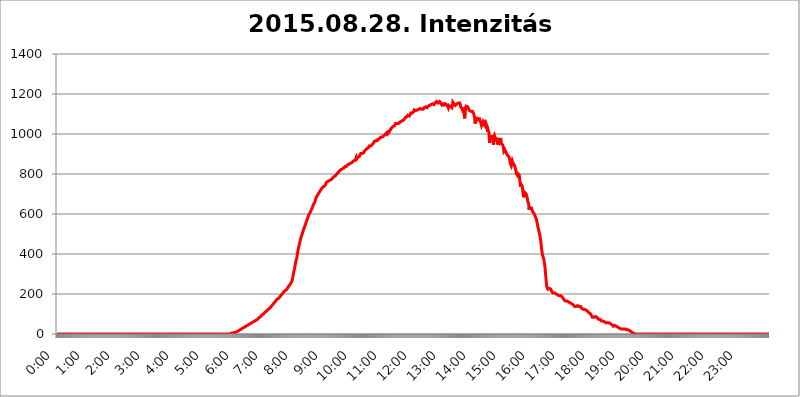
| Category | 2015.08.28. Intenzitás [W/m^2] |
|---|---|
| 0.0 | 0 |
| 0.0006944444444444445 | 0 |
| 0.001388888888888889 | 0 |
| 0.0020833333333333333 | 0 |
| 0.002777777777777778 | 0 |
| 0.003472222222222222 | 0 |
| 0.004166666666666667 | 0 |
| 0.004861111111111111 | 0 |
| 0.005555555555555556 | 0 |
| 0.0062499999999999995 | 0 |
| 0.006944444444444444 | 0 |
| 0.007638888888888889 | 0 |
| 0.008333333333333333 | 0 |
| 0.009027777777777779 | 0 |
| 0.009722222222222222 | 0 |
| 0.010416666666666666 | 0 |
| 0.011111111111111112 | 0 |
| 0.011805555555555555 | 0 |
| 0.012499999999999999 | 0 |
| 0.013194444444444444 | 0 |
| 0.013888888888888888 | 0 |
| 0.014583333333333332 | 0 |
| 0.015277777777777777 | 0 |
| 0.015972222222222224 | 0 |
| 0.016666666666666666 | 0 |
| 0.017361111111111112 | 0 |
| 0.018055555555555557 | 0 |
| 0.01875 | 0 |
| 0.019444444444444445 | 0 |
| 0.02013888888888889 | 0 |
| 0.020833333333333332 | 0 |
| 0.02152777777777778 | 0 |
| 0.022222222222222223 | 0 |
| 0.02291666666666667 | 0 |
| 0.02361111111111111 | 0 |
| 0.024305555555555556 | 0 |
| 0.024999999999999998 | 0 |
| 0.025694444444444447 | 0 |
| 0.02638888888888889 | 0 |
| 0.027083333333333334 | 0 |
| 0.027777777777777776 | 0 |
| 0.02847222222222222 | 0 |
| 0.029166666666666664 | 0 |
| 0.029861111111111113 | 0 |
| 0.030555555555555555 | 0 |
| 0.03125 | 0 |
| 0.03194444444444445 | 0 |
| 0.03263888888888889 | 0 |
| 0.03333333333333333 | 0 |
| 0.034027777777777775 | 0 |
| 0.034722222222222224 | 0 |
| 0.035416666666666666 | 0 |
| 0.036111111111111115 | 0 |
| 0.03680555555555556 | 0 |
| 0.0375 | 0 |
| 0.03819444444444444 | 0 |
| 0.03888888888888889 | 0 |
| 0.03958333333333333 | 0 |
| 0.04027777777777778 | 0 |
| 0.04097222222222222 | 0 |
| 0.041666666666666664 | 0 |
| 0.042361111111111106 | 0 |
| 0.04305555555555556 | 0 |
| 0.043750000000000004 | 0 |
| 0.044444444444444446 | 0 |
| 0.04513888888888889 | 0 |
| 0.04583333333333334 | 0 |
| 0.04652777777777778 | 0 |
| 0.04722222222222222 | 0 |
| 0.04791666666666666 | 0 |
| 0.04861111111111111 | 0 |
| 0.049305555555555554 | 0 |
| 0.049999999999999996 | 0 |
| 0.05069444444444445 | 0 |
| 0.051388888888888894 | 0 |
| 0.052083333333333336 | 0 |
| 0.05277777777777778 | 0 |
| 0.05347222222222222 | 0 |
| 0.05416666666666667 | 0 |
| 0.05486111111111111 | 0 |
| 0.05555555555555555 | 0 |
| 0.05625 | 0 |
| 0.05694444444444444 | 0 |
| 0.057638888888888885 | 0 |
| 0.05833333333333333 | 0 |
| 0.05902777777777778 | 0 |
| 0.059722222222222225 | 0 |
| 0.06041666666666667 | 0 |
| 0.061111111111111116 | 0 |
| 0.06180555555555556 | 0 |
| 0.0625 | 0 |
| 0.06319444444444444 | 0 |
| 0.06388888888888888 | 0 |
| 0.06458333333333334 | 0 |
| 0.06527777777777778 | 0 |
| 0.06597222222222222 | 0 |
| 0.06666666666666667 | 0 |
| 0.06736111111111111 | 0 |
| 0.06805555555555555 | 0 |
| 0.06874999999999999 | 0 |
| 0.06944444444444443 | 0 |
| 0.07013888888888889 | 0 |
| 0.07083333333333333 | 0 |
| 0.07152777777777779 | 0 |
| 0.07222222222222223 | 0 |
| 0.07291666666666667 | 0 |
| 0.07361111111111111 | 0 |
| 0.07430555555555556 | 0 |
| 0.075 | 0 |
| 0.07569444444444444 | 0 |
| 0.0763888888888889 | 0 |
| 0.07708333333333334 | 0 |
| 0.07777777777777778 | 0 |
| 0.07847222222222222 | 0 |
| 0.07916666666666666 | 0 |
| 0.0798611111111111 | 0 |
| 0.08055555555555556 | 0 |
| 0.08125 | 0 |
| 0.08194444444444444 | 0 |
| 0.08263888888888889 | 0 |
| 0.08333333333333333 | 0 |
| 0.08402777777777777 | 0 |
| 0.08472222222222221 | 0 |
| 0.08541666666666665 | 0 |
| 0.08611111111111112 | 0 |
| 0.08680555555555557 | 0 |
| 0.08750000000000001 | 0 |
| 0.08819444444444445 | 0 |
| 0.08888888888888889 | 0 |
| 0.08958333333333333 | 0 |
| 0.09027777777777778 | 0 |
| 0.09097222222222222 | 0 |
| 0.09166666666666667 | 0 |
| 0.09236111111111112 | 0 |
| 0.09305555555555556 | 0 |
| 0.09375 | 0 |
| 0.09444444444444444 | 0 |
| 0.09513888888888888 | 0 |
| 0.09583333333333333 | 0 |
| 0.09652777777777777 | 0 |
| 0.09722222222222222 | 0 |
| 0.09791666666666667 | 0 |
| 0.09861111111111111 | 0 |
| 0.09930555555555555 | 0 |
| 0.09999999999999999 | 0 |
| 0.10069444444444443 | 0 |
| 0.1013888888888889 | 0 |
| 0.10208333333333335 | 0 |
| 0.10277777777777779 | 0 |
| 0.10347222222222223 | 0 |
| 0.10416666666666667 | 0 |
| 0.10486111111111111 | 0 |
| 0.10555555555555556 | 0 |
| 0.10625 | 0 |
| 0.10694444444444444 | 0 |
| 0.1076388888888889 | 0 |
| 0.10833333333333334 | 0 |
| 0.10902777777777778 | 0 |
| 0.10972222222222222 | 0 |
| 0.1111111111111111 | 0 |
| 0.11180555555555556 | 0 |
| 0.11180555555555556 | 0 |
| 0.1125 | 0 |
| 0.11319444444444444 | 0 |
| 0.11388888888888889 | 0 |
| 0.11458333333333333 | 0 |
| 0.11527777777777777 | 0 |
| 0.11597222222222221 | 0 |
| 0.11666666666666665 | 0 |
| 0.1173611111111111 | 0 |
| 0.11805555555555557 | 0 |
| 0.11944444444444445 | 0 |
| 0.12013888888888889 | 0 |
| 0.12083333333333333 | 0 |
| 0.12152777777777778 | 0 |
| 0.12222222222222223 | 0 |
| 0.12291666666666667 | 0 |
| 0.12291666666666667 | 0 |
| 0.12361111111111112 | 0 |
| 0.12430555555555556 | 0 |
| 0.125 | 0 |
| 0.12569444444444444 | 0 |
| 0.12638888888888888 | 0 |
| 0.12708333333333333 | 0 |
| 0.16875 | 0 |
| 0.12847222222222224 | 0 |
| 0.12916666666666668 | 0 |
| 0.12986111111111112 | 0 |
| 0.13055555555555556 | 0 |
| 0.13125 | 0 |
| 0.13194444444444445 | 0 |
| 0.1326388888888889 | 0 |
| 0.13333333333333333 | 0 |
| 0.13402777777777777 | 0 |
| 0.13402777777777777 | 0 |
| 0.13472222222222222 | 0 |
| 0.13541666666666666 | 0 |
| 0.1361111111111111 | 0 |
| 0.13749999999999998 | 0 |
| 0.13819444444444443 | 0 |
| 0.1388888888888889 | 0 |
| 0.13958333333333334 | 0 |
| 0.14027777777777778 | 0 |
| 0.14097222222222222 | 0 |
| 0.14166666666666666 | 0 |
| 0.1423611111111111 | 0 |
| 0.14305555555555557 | 0 |
| 0.14375000000000002 | 0 |
| 0.14444444444444446 | 0 |
| 0.1451388888888889 | 0 |
| 0.1451388888888889 | 0 |
| 0.14652777777777778 | 0 |
| 0.14722222222222223 | 0 |
| 0.14791666666666667 | 0 |
| 0.1486111111111111 | 0 |
| 0.14930555555555555 | 0 |
| 0.15 | 0 |
| 0.15069444444444444 | 0 |
| 0.15138888888888888 | 0 |
| 0.15208333333333332 | 0 |
| 0.15277777777777776 | 0 |
| 0.15347222222222223 | 0 |
| 0.15416666666666667 | 0 |
| 0.15486111111111112 | 0 |
| 0.15555555555555556 | 0 |
| 0.15625 | 0 |
| 0.15694444444444444 | 0 |
| 0.15763888888888888 | 0 |
| 0.15833333333333333 | 0 |
| 0.15902777777777777 | 0 |
| 0.15972222222222224 | 0 |
| 0.16041666666666668 | 0 |
| 0.16111111111111112 | 0 |
| 0.16180555555555556 | 0 |
| 0.1625 | 0 |
| 0.16319444444444445 | 0 |
| 0.1638888888888889 | 0 |
| 0.16458333333333333 | 0 |
| 0.16527777777777777 | 0 |
| 0.16597222222222222 | 0 |
| 0.16666666666666666 | 0 |
| 0.1673611111111111 | 0 |
| 0.16805555555555554 | 0 |
| 0.16874999999999998 | 0 |
| 0.16944444444444443 | 0 |
| 0.17013888888888887 | 0 |
| 0.1708333333333333 | 0 |
| 0.17152777777777775 | 0 |
| 0.17222222222222225 | 0 |
| 0.1729166666666667 | 0 |
| 0.17361111111111113 | 0 |
| 0.17430555555555557 | 0 |
| 0.17500000000000002 | 0 |
| 0.17569444444444446 | 0 |
| 0.1763888888888889 | 0 |
| 0.17708333333333334 | 0 |
| 0.17777777777777778 | 0 |
| 0.17847222222222223 | 0 |
| 0.17916666666666667 | 0 |
| 0.1798611111111111 | 0 |
| 0.18055555555555555 | 0 |
| 0.18125 | 0 |
| 0.18194444444444444 | 0 |
| 0.1826388888888889 | 0 |
| 0.18333333333333335 | 0 |
| 0.1840277777777778 | 0 |
| 0.18472222222222223 | 0 |
| 0.18541666666666667 | 0 |
| 0.18611111111111112 | 0 |
| 0.18680555555555556 | 0 |
| 0.1875 | 0 |
| 0.18819444444444444 | 0 |
| 0.18888888888888888 | 0 |
| 0.18958333333333333 | 0 |
| 0.19027777777777777 | 0 |
| 0.1909722222222222 | 0 |
| 0.19166666666666665 | 0 |
| 0.19236111111111112 | 0 |
| 0.19305555555555554 | 0 |
| 0.19375 | 0 |
| 0.19444444444444445 | 0 |
| 0.1951388888888889 | 0 |
| 0.19583333333333333 | 0 |
| 0.19652777777777777 | 0 |
| 0.19722222222222222 | 0 |
| 0.19791666666666666 | 0 |
| 0.1986111111111111 | 0 |
| 0.19930555555555554 | 0 |
| 0.19999999999999998 | 0 |
| 0.20069444444444443 | 0 |
| 0.20138888888888887 | 0 |
| 0.2020833333333333 | 0 |
| 0.2027777777777778 | 0 |
| 0.2034722222222222 | 0 |
| 0.2041666666666667 | 0 |
| 0.20486111111111113 | 0 |
| 0.20555555555555557 | 0 |
| 0.20625000000000002 | 0 |
| 0.20694444444444446 | 0 |
| 0.2076388888888889 | 0 |
| 0.20833333333333334 | 0 |
| 0.20902777777777778 | 0 |
| 0.20972222222222223 | 0 |
| 0.21041666666666667 | 0 |
| 0.2111111111111111 | 0 |
| 0.21180555555555555 | 0 |
| 0.2125 | 0 |
| 0.21319444444444444 | 0 |
| 0.2138888888888889 | 0 |
| 0.21458333333333335 | 0 |
| 0.2152777777777778 | 0 |
| 0.21597222222222223 | 0 |
| 0.21666666666666667 | 0 |
| 0.21736111111111112 | 0 |
| 0.21805555555555556 | 0 |
| 0.21875 | 0 |
| 0.21944444444444444 | 0 |
| 0.22013888888888888 | 0 |
| 0.22083333333333333 | 0 |
| 0.22152777777777777 | 0 |
| 0.2222222222222222 | 0 |
| 0.22291666666666665 | 0 |
| 0.2236111111111111 | 0 |
| 0.22430555555555556 | 0 |
| 0.225 | 0 |
| 0.22569444444444445 | 0 |
| 0.2263888888888889 | 0 |
| 0.22708333333333333 | 0 |
| 0.22777777777777777 | 0 |
| 0.22847222222222222 | 0 |
| 0.22916666666666666 | 0 |
| 0.2298611111111111 | 0 |
| 0.23055555555555554 | 0 |
| 0.23124999999999998 | 0 |
| 0.23194444444444443 | 0 |
| 0.23263888888888887 | 0 |
| 0.2333333333333333 | 0 |
| 0.2340277777777778 | 0 |
| 0.2347222222222222 | 0 |
| 0.2354166666666667 | 0 |
| 0.23611111111111113 | 0 |
| 0.23680555555555557 | 0 |
| 0.23750000000000002 | 0 |
| 0.23819444444444446 | 0 |
| 0.2388888888888889 | 0 |
| 0.23958333333333334 | 0 |
| 0.24027777777777778 | 0 |
| 0.24097222222222223 | 0 |
| 0.24166666666666667 | 0 |
| 0.2423611111111111 | 3.525 |
| 0.24305555555555555 | 3.525 |
| 0.24375 | 3.525 |
| 0.24444444444444446 | 3.525 |
| 0.24513888888888888 | 3.525 |
| 0.24583333333333335 | 3.525 |
| 0.2465277777777778 | 3.525 |
| 0.24722222222222223 | 7.887 |
| 0.24791666666666667 | 7.887 |
| 0.24861111111111112 | 7.887 |
| 0.24930555555555556 | 7.887 |
| 0.25 | 7.887 |
| 0.25069444444444444 | 12.257 |
| 0.2513888888888889 | 12.257 |
| 0.2520833333333333 | 12.257 |
| 0.25277777777777777 | 12.257 |
| 0.2534722222222222 | 16.636 |
| 0.25416666666666665 | 16.636 |
| 0.2548611111111111 | 16.636 |
| 0.2555555555555556 | 21.024 |
| 0.25625000000000003 | 21.024 |
| 0.2569444444444445 | 21.024 |
| 0.2576388888888889 | 21.024 |
| 0.25833333333333336 | 25.419 |
| 0.2590277777777778 | 25.419 |
| 0.25972222222222224 | 29.823 |
| 0.2604166666666667 | 29.823 |
| 0.2611111111111111 | 29.823 |
| 0.26180555555555557 | 34.234 |
| 0.2625 | 34.234 |
| 0.26319444444444445 | 34.234 |
| 0.2638888888888889 | 38.653 |
| 0.26458333333333334 | 38.653 |
| 0.2652777777777778 | 38.653 |
| 0.2659722222222222 | 43.079 |
| 0.26666666666666666 | 43.079 |
| 0.2673611111111111 | 43.079 |
| 0.26805555555555555 | 47.511 |
| 0.26875 | 47.511 |
| 0.26944444444444443 | 47.511 |
| 0.2701388888888889 | 47.511 |
| 0.2708333333333333 | 51.951 |
| 0.27152777777777776 | 51.951 |
| 0.2722222222222222 | 56.398 |
| 0.27291666666666664 | 56.398 |
| 0.2736111111111111 | 56.398 |
| 0.2743055555555555 | 56.398 |
| 0.27499999999999997 | 60.85 |
| 0.27569444444444446 | 60.85 |
| 0.27638888888888885 | 65.31 |
| 0.27708333333333335 | 65.31 |
| 0.2777777777777778 | 65.31 |
| 0.27847222222222223 | 65.31 |
| 0.2791666666666667 | 69.775 |
| 0.2798611111111111 | 69.775 |
| 0.28055555555555556 | 74.246 |
| 0.28125 | 74.246 |
| 0.28194444444444444 | 74.246 |
| 0.2826388888888889 | 78.722 |
| 0.2833333333333333 | 83.205 |
| 0.28402777777777777 | 83.205 |
| 0.2847222222222222 | 87.692 |
| 0.28541666666666665 | 87.692 |
| 0.28611111111111115 | 92.184 |
| 0.28680555555555554 | 92.184 |
| 0.28750000000000003 | 96.682 |
| 0.2881944444444445 | 96.682 |
| 0.2888888888888889 | 101.184 |
| 0.28958333333333336 | 101.184 |
| 0.2902777777777778 | 101.184 |
| 0.29097222222222224 | 105.69 |
| 0.2916666666666667 | 110.201 |
| 0.2923611111111111 | 110.201 |
| 0.29305555555555557 | 110.201 |
| 0.29375 | 114.716 |
| 0.29444444444444445 | 119.235 |
| 0.2951388888888889 | 119.235 |
| 0.29583333333333334 | 123.758 |
| 0.2965277777777778 | 123.758 |
| 0.2972222222222222 | 128.284 |
| 0.29791666666666666 | 128.284 |
| 0.2986111111111111 | 132.814 |
| 0.29930555555555555 | 132.814 |
| 0.3 | 137.347 |
| 0.30069444444444443 | 137.347 |
| 0.3013888888888889 | 141.884 |
| 0.3020833333333333 | 146.423 |
| 0.30277777777777776 | 146.423 |
| 0.3034722222222222 | 150.964 |
| 0.30416666666666664 | 155.509 |
| 0.3048611111111111 | 155.509 |
| 0.3055555555555555 | 160.056 |
| 0.30624999999999997 | 164.605 |
| 0.3069444444444444 | 164.605 |
| 0.3076388888888889 | 169.156 |
| 0.30833333333333335 | 173.709 |
| 0.3090277777777778 | 173.709 |
| 0.30972222222222223 | 178.264 |
| 0.3104166666666667 | 178.264 |
| 0.3111111111111111 | 182.82 |
| 0.31180555555555556 | 182.82 |
| 0.3125 | 187.378 |
| 0.31319444444444444 | 191.937 |
| 0.3138888888888889 | 191.937 |
| 0.3145833333333333 | 196.497 |
| 0.31527777777777777 | 201.058 |
| 0.3159722222222222 | 201.058 |
| 0.31666666666666665 | 205.62 |
| 0.31736111111111115 | 210.182 |
| 0.31805555555555554 | 210.182 |
| 0.31875000000000003 | 214.746 |
| 0.3194444444444445 | 214.746 |
| 0.3201388888888889 | 219.309 |
| 0.32083333333333336 | 219.309 |
| 0.3215277777777778 | 223.873 |
| 0.32222222222222224 | 223.873 |
| 0.3229166666666667 | 228.436 |
| 0.3236111111111111 | 233 |
| 0.32430555555555557 | 237.564 |
| 0.325 | 242.127 |
| 0.32569444444444445 | 242.127 |
| 0.3263888888888889 | 246.689 |
| 0.32708333333333334 | 251.251 |
| 0.3277777777777778 | 255.813 |
| 0.3284722222222222 | 260.373 |
| 0.32916666666666666 | 264.932 |
| 0.3298611111111111 | 274.047 |
| 0.33055555555555555 | 287.709 |
| 0.33125 | 301.354 |
| 0.33194444444444443 | 314.98 |
| 0.3326388888888889 | 324.052 |
| 0.3333333333333333 | 337.639 |
| 0.3340277777777778 | 351.198 |
| 0.3347222222222222 | 364.728 |
| 0.3354166666666667 | 373.729 |
| 0.3361111111111111 | 382.715 |
| 0.3368055555555556 | 400.638 |
| 0.33749999999999997 | 414.035 |
| 0.33819444444444446 | 427.39 |
| 0.33888888888888885 | 436.27 |
| 0.33958333333333335 | 449.551 |
| 0.34027777777777773 | 458.38 |
| 0.34097222222222223 | 471.582 |
| 0.3416666666666666 | 480.356 |
| 0.3423611111111111 | 489.108 |
| 0.3430555555555555 | 493.475 |
| 0.34375 | 502.192 |
| 0.3444444444444445 | 510.885 |
| 0.3451388888888889 | 519.555 |
| 0.3458333333333334 | 523.88 |
| 0.34652777777777777 | 532.513 |
| 0.34722222222222227 | 536.82 |
| 0.34791666666666665 | 545.416 |
| 0.34861111111111115 | 553.986 |
| 0.34930555555555554 | 558.261 |
| 0.35000000000000003 | 566.793 |
| 0.3506944444444444 | 575.299 |
| 0.3513888888888889 | 579.542 |
| 0.3520833333333333 | 588.009 |
| 0.3527777777777778 | 596.45 |
| 0.3534722222222222 | 600.661 |
| 0.3541666666666667 | 604.864 |
| 0.3548611111111111 | 609.062 |
| 0.35555555555555557 | 613.252 |
| 0.35625 | 621.613 |
| 0.35694444444444445 | 625.784 |
| 0.3576388888888889 | 629.948 |
| 0.35833333333333334 | 638.256 |
| 0.3590277777777778 | 642.4 |
| 0.3597222222222222 | 650.667 |
| 0.36041666666666666 | 654.791 |
| 0.3611111111111111 | 658.909 |
| 0.36180555555555555 | 667.123 |
| 0.3625 | 671.22 |
| 0.36319444444444443 | 683.473 |
| 0.3638888888888889 | 687.544 |
| 0.3645833333333333 | 687.544 |
| 0.3652777777777778 | 695.666 |
| 0.3659722222222222 | 695.666 |
| 0.3666666666666667 | 703.762 |
| 0.3673611111111111 | 703.762 |
| 0.3680555555555556 | 707.8 |
| 0.36874999999999997 | 715.858 |
| 0.36944444444444446 | 715.858 |
| 0.37013888888888885 | 719.877 |
| 0.37083333333333335 | 727.896 |
| 0.37152777777777773 | 731.896 |
| 0.37222222222222223 | 731.896 |
| 0.3729166666666666 | 735.89 |
| 0.3736111111111111 | 735.89 |
| 0.3743055555555555 | 735.89 |
| 0.375 | 739.877 |
| 0.3756944444444445 | 743.859 |
| 0.3763888888888889 | 747.834 |
| 0.3770833333333334 | 751.803 |
| 0.37777777777777777 | 759.723 |
| 0.37847222222222227 | 759.723 |
| 0.37916666666666665 | 759.723 |
| 0.37986111111111115 | 763.674 |
| 0.38055555555555554 | 759.723 |
| 0.38125000000000003 | 767.62 |
| 0.3819444444444444 | 767.62 |
| 0.3826388888888889 | 767.62 |
| 0.3833333333333333 | 767.62 |
| 0.3840277777777778 | 771.559 |
| 0.3847222222222222 | 771.559 |
| 0.3854166666666667 | 771.559 |
| 0.3861111111111111 | 779.42 |
| 0.38680555555555557 | 783.342 |
| 0.3875 | 783.342 |
| 0.38819444444444445 | 787.258 |
| 0.3888888888888889 | 791.169 |
| 0.38958333333333334 | 791.169 |
| 0.3902777777777778 | 791.169 |
| 0.3909722222222222 | 795.074 |
| 0.39166666666666666 | 798.974 |
| 0.3923611111111111 | 802.868 |
| 0.39305555555555555 | 802.868 |
| 0.39375 | 806.757 |
| 0.39444444444444443 | 810.641 |
| 0.3951388888888889 | 810.641 |
| 0.3958333333333333 | 814.519 |
| 0.3965277777777778 | 814.519 |
| 0.3972222222222222 | 814.519 |
| 0.3979166666666667 | 822.26 |
| 0.3986111111111111 | 822.26 |
| 0.3993055555555556 | 826.123 |
| 0.39999999999999997 | 826.123 |
| 0.40069444444444446 | 829.981 |
| 0.40138888888888885 | 829.981 |
| 0.40208333333333335 | 829.981 |
| 0.40277777777777773 | 829.981 |
| 0.40347222222222223 | 837.682 |
| 0.4041666666666666 | 837.682 |
| 0.4048611111111111 | 837.682 |
| 0.4055555555555555 | 837.682 |
| 0.40625 | 841.526 |
| 0.4069444444444445 | 845.365 |
| 0.4076388888888889 | 845.365 |
| 0.4083333333333334 | 845.365 |
| 0.40902777777777777 | 849.199 |
| 0.40972222222222227 | 853.029 |
| 0.41041666666666665 | 853.029 |
| 0.41111111111111115 | 853.029 |
| 0.41180555555555554 | 853.029 |
| 0.41250000000000003 | 853.029 |
| 0.4131944444444444 | 856.855 |
| 0.4138888888888889 | 856.855 |
| 0.4145833333333333 | 860.676 |
| 0.4152777777777778 | 864.493 |
| 0.4159722222222222 | 868.305 |
| 0.4166666666666667 | 868.305 |
| 0.4173611111111111 | 868.305 |
| 0.41805555555555557 | 872.114 |
| 0.41875 | 875.918 |
| 0.41944444444444445 | 883.516 |
| 0.4201388888888889 | 875.918 |
| 0.42083333333333334 | 875.918 |
| 0.4215277777777778 | 883.516 |
| 0.4222222222222222 | 887.309 |
| 0.42291666666666666 | 887.309 |
| 0.4236111111111111 | 887.309 |
| 0.42430555555555555 | 894.885 |
| 0.425 | 894.885 |
| 0.42569444444444443 | 902.447 |
| 0.4263888888888889 | 906.223 |
| 0.4270833333333333 | 902.447 |
| 0.4277777777777778 | 902.447 |
| 0.4284722222222222 | 902.447 |
| 0.4291666666666667 | 906.223 |
| 0.4298611111111111 | 906.223 |
| 0.4305555555555556 | 913.766 |
| 0.43124999999999997 | 913.766 |
| 0.43194444444444446 | 917.534 |
| 0.43263888888888885 | 921.298 |
| 0.43333333333333335 | 925.06 |
| 0.43402777777777773 | 925.06 |
| 0.43472222222222223 | 928.819 |
| 0.4354166666666666 | 932.576 |
| 0.4361111111111111 | 928.819 |
| 0.4368055555555555 | 932.576 |
| 0.4375 | 940.082 |
| 0.4381944444444445 | 936.33 |
| 0.4388888888888889 | 936.33 |
| 0.4395833333333334 | 940.082 |
| 0.44027777777777777 | 940.082 |
| 0.44097222222222227 | 943.832 |
| 0.44166666666666665 | 947.58 |
| 0.44236111111111115 | 951.327 |
| 0.44305555555555554 | 951.327 |
| 0.44375000000000003 | 955.071 |
| 0.4444444444444444 | 962.555 |
| 0.4451388888888889 | 962.555 |
| 0.4458333333333333 | 966.295 |
| 0.4465277777777778 | 966.295 |
| 0.4472222222222222 | 966.295 |
| 0.4479166666666667 | 966.295 |
| 0.4486111111111111 | 966.295 |
| 0.44930555555555557 | 966.295 |
| 0.45 | 973.772 |
| 0.45069444444444445 | 973.772 |
| 0.4513888888888889 | 970.034 |
| 0.45208333333333334 | 977.508 |
| 0.4527777777777778 | 977.508 |
| 0.4534722222222222 | 981.244 |
| 0.45416666666666666 | 984.98 |
| 0.4548611111111111 | 984.98 |
| 0.45555555555555555 | 984.98 |
| 0.45625 | 984.98 |
| 0.45694444444444443 | 984.98 |
| 0.4576388888888889 | 988.714 |
| 0.4583333333333333 | 992.448 |
| 0.4590277777777778 | 992.448 |
| 0.4597222222222222 | 992.448 |
| 0.4604166666666667 | 999.916 |
| 0.4611111111111111 | 1003.65 |
| 0.4618055555555556 | 996.182 |
| 0.46249999999999997 | 1007.383 |
| 0.46319444444444446 | 999.916 |
| 0.46388888888888885 | 999.916 |
| 0.46458333333333335 | 1003.65 |
| 0.46527777777777773 | 1007.383 |
| 0.46597222222222223 | 1014.852 |
| 0.4666666666666666 | 1018.587 |
| 0.4673611111111111 | 1022.323 |
| 0.4680555555555555 | 1022.323 |
| 0.46875 | 1029.798 |
| 0.4694444444444445 | 1029.798 |
| 0.4701388888888889 | 1029.798 |
| 0.4708333333333334 | 1037.277 |
| 0.47152777777777777 | 1041.019 |
| 0.47222222222222227 | 1041.019 |
| 0.47291666666666665 | 1041.019 |
| 0.47361111111111115 | 1044.762 |
| 0.47430555555555554 | 1052.255 |
| 0.47500000000000003 | 1052.255 |
| 0.4756944444444444 | 1048.508 |
| 0.4763888888888889 | 1052.255 |
| 0.4770833333333333 | 1056.004 |
| 0.4777777777777778 | 1052.255 |
| 0.4784722222222222 | 1052.255 |
| 0.4791666666666667 | 1056.004 |
| 0.4798611111111111 | 1056.004 |
| 0.48055555555555557 | 1059.756 |
| 0.48125 | 1059.756 |
| 0.48194444444444445 | 1063.51 |
| 0.4826388888888889 | 1063.51 |
| 0.48333333333333334 | 1063.51 |
| 0.4840277777777778 | 1067.267 |
| 0.4847222222222222 | 1067.267 |
| 0.48541666666666666 | 1067.267 |
| 0.4861111111111111 | 1071.027 |
| 0.48680555555555555 | 1074.789 |
| 0.4875 | 1078.555 |
| 0.48819444444444443 | 1082.324 |
| 0.4888888888888889 | 1082.324 |
| 0.4895833333333333 | 1086.097 |
| 0.4902777777777778 | 1086.097 |
| 0.4909722222222222 | 1089.873 |
| 0.4916666666666667 | 1093.653 |
| 0.4923611111111111 | 1093.653 |
| 0.4930555555555556 | 1093.653 |
| 0.49374999999999997 | 1089.873 |
| 0.49444444444444446 | 1093.653 |
| 0.49513888888888885 | 1097.437 |
| 0.49583333333333335 | 1105.019 |
| 0.49652777777777773 | 1105.019 |
| 0.49722222222222223 | 1105.019 |
| 0.4979166666666666 | 1105.019 |
| 0.4986111111111111 | 1108.816 |
| 0.4993055555555555 | 1108.816 |
| 0.5 | 1112.618 |
| 0.5006944444444444 | 1120.238 |
| 0.5013888888888889 | 1116.426 |
| 0.5020833333333333 | 1116.426 |
| 0.5027777777777778 | 1116.426 |
| 0.5034722222222222 | 1116.426 |
| 0.5041666666666667 | 1116.426 |
| 0.5048611111111111 | 1120.238 |
| 0.5055555555555555 | 1120.238 |
| 0.50625 | 1124.056 |
| 0.5069444444444444 | 1124.056 |
| 0.5076388888888889 | 1127.879 |
| 0.5083333333333333 | 1127.879 |
| 0.5090277777777777 | 1127.879 |
| 0.5097222222222222 | 1124.056 |
| 0.5104166666666666 | 1124.056 |
| 0.5111111111111112 | 1124.056 |
| 0.5118055555555555 | 1124.056 |
| 0.5125000000000001 | 1124.056 |
| 0.5131944444444444 | 1124.056 |
| 0.513888888888889 | 1127.879 |
| 0.5145833333333333 | 1131.708 |
| 0.5152777777777778 | 1135.543 |
| 0.5159722222222222 | 1135.543 |
| 0.5166666666666667 | 1135.543 |
| 0.517361111111111 | 1135.543 |
| 0.5180555555555556 | 1131.708 |
| 0.5187499999999999 | 1131.708 |
| 0.5194444444444445 | 1131.708 |
| 0.5201388888888888 | 1139.384 |
| 0.5208333333333334 | 1139.384 |
| 0.5215277777777778 | 1139.384 |
| 0.5222222222222223 | 1143.232 |
| 0.5229166666666667 | 1139.384 |
| 0.5236111111111111 | 1147.086 |
| 0.5243055555555556 | 1147.086 |
| 0.525 | 1147.086 |
| 0.5256944444444445 | 1147.086 |
| 0.5263888888888889 | 1150.946 |
| 0.5270833333333333 | 1147.086 |
| 0.5277777777777778 | 1147.086 |
| 0.5284722222222222 | 1147.086 |
| 0.5291666666666667 | 1150.946 |
| 0.5298611111111111 | 1154.814 |
| 0.5305555555555556 | 1158.689 |
| 0.53125 | 1154.814 |
| 0.5319444444444444 | 1162.571 |
| 0.5326388888888889 | 1158.689 |
| 0.5333333333333333 | 1158.689 |
| 0.5340277777777778 | 1154.814 |
| 0.5347222222222222 | 1158.689 |
| 0.5354166666666667 | 1158.689 |
| 0.5361111111111111 | 1162.571 |
| 0.5368055555555555 | 1162.571 |
| 0.5375 | 1158.689 |
| 0.5381944444444444 | 1154.814 |
| 0.5388888888888889 | 1150.946 |
| 0.5395833333333333 | 1143.232 |
| 0.5402777777777777 | 1139.384 |
| 0.5409722222222222 | 1139.384 |
| 0.5416666666666666 | 1143.232 |
| 0.5423611111111112 | 1150.946 |
| 0.5430555555555555 | 1154.814 |
| 0.5437500000000001 | 1150.946 |
| 0.5444444444444444 | 1150.946 |
| 0.545138888888889 | 1147.086 |
| 0.5458333333333333 | 1147.086 |
| 0.5465277777777778 | 1143.232 |
| 0.5472222222222222 | 1150.946 |
| 0.5479166666666667 | 1139.384 |
| 0.548611111111111 | 1131.708 |
| 0.5493055555555556 | 1139.384 |
| 0.5499999999999999 | 1139.384 |
| 0.5506944444444445 | 1143.232 |
| 0.5513888888888888 | 1139.384 |
| 0.5520833333333334 | 1139.384 |
| 0.5527777777777778 | 1139.384 |
| 0.5534722222222223 | 1131.708 |
| 0.5541666666666667 | 1139.384 |
| 0.5548611111111111 | 1158.689 |
| 0.5555555555555556 | 1154.814 |
| 0.55625 | 1150.946 |
| 0.5569444444444445 | 1150.946 |
| 0.5576388888888889 | 1150.946 |
| 0.5583333333333333 | 1143.232 |
| 0.5590277777777778 | 1147.086 |
| 0.5597222222222222 | 1147.086 |
| 0.5604166666666667 | 1150.946 |
| 0.5611111111111111 | 1150.946 |
| 0.5618055555555556 | 1150.946 |
| 0.5625 | 1154.814 |
| 0.5631944444444444 | 1154.814 |
| 0.5638888888888889 | 1154.814 |
| 0.5645833333333333 | 1154.814 |
| 0.5652777777777778 | 1147.086 |
| 0.5659722222222222 | 1135.543 |
| 0.5666666666666667 | 1131.708 |
| 0.5673611111111111 | 1135.543 |
| 0.5680555555555555 | 1124.056 |
| 0.56875 | 1131.708 |
| 0.5694444444444444 | 1108.816 |
| 0.5701388888888889 | 1120.238 |
| 0.5708333333333333 | 1120.238 |
| 0.5715277777777777 | 1078.555 |
| 0.5722222222222222 | 1127.879 |
| 0.5729166666666666 | 1131.708 |
| 0.5736111111111112 | 1139.384 |
| 0.5743055555555555 | 1135.543 |
| 0.5750000000000001 | 1135.543 |
| 0.5756944444444444 | 1135.543 |
| 0.576388888888889 | 1131.708 |
| 0.5770833333333333 | 1124.056 |
| 0.5777777777777778 | 1127.879 |
| 0.5784722222222222 | 1116.426 |
| 0.5791666666666667 | 1116.426 |
| 0.579861111111111 | 1116.426 |
| 0.5805555555555556 | 1112.618 |
| 0.5812499999999999 | 1112.618 |
| 0.5819444444444445 | 1112.618 |
| 0.5826388888888888 | 1112.618 |
| 0.5833333333333334 | 1112.618 |
| 0.5840277777777778 | 1101.226 |
| 0.5847222222222223 | 1093.653 |
| 0.5854166666666667 | 1078.555 |
| 0.5861111111111111 | 1052.255 |
| 0.5868055555555556 | 1052.255 |
| 0.5875 | 1078.555 |
| 0.5881944444444445 | 1078.555 |
| 0.5888888888888889 | 1074.789 |
| 0.5895833333333333 | 1078.555 |
| 0.5902777777777778 | 1071.027 |
| 0.5909722222222222 | 1067.267 |
| 0.5916666666666667 | 1074.789 |
| 0.5923611111111111 | 1074.789 |
| 0.5930555555555556 | 1067.267 |
| 0.59375 | 1059.756 |
| 0.5944444444444444 | 1059.756 |
| 0.5951388888888889 | 1041.019 |
| 0.5958333333333333 | 1037.277 |
| 0.5965277777777778 | 1052.255 |
| 0.5972222222222222 | 1059.756 |
| 0.5979166666666667 | 1052.255 |
| 0.5986111111111111 | 1048.508 |
| 0.5993055555555555 | 1044.762 |
| 0.6 | 1052.255 |
| 0.6006944444444444 | 1044.762 |
| 0.6013888888888889 | 1052.255 |
| 0.6020833333333333 | 1044.762 |
| 0.6027777777777777 | 1033.537 |
| 0.6034722222222222 | 1011.118 |
| 0.6041666666666666 | 1022.323 |
| 0.6048611111111112 | 1018.587 |
| 0.6055555555555555 | 1007.383 |
| 0.6062500000000001 | 955.071 |
| 0.6069444444444444 | 977.508 |
| 0.607638888888889 | 992.448 |
| 0.6083333333333333 | 973.772 |
| 0.6090277777777778 | 992.448 |
| 0.6097222222222222 | 988.714 |
| 0.6104166666666667 | 973.772 |
| 0.611111111111111 | 984.98 |
| 0.6118055555555556 | 947.58 |
| 0.6124999999999999 | 984.98 |
| 0.6131944444444445 | 992.448 |
| 0.6138888888888888 | 984.98 |
| 0.6145833333333334 | 981.244 |
| 0.6152777777777778 | 973.772 |
| 0.6159722222222223 | 977.508 |
| 0.6166666666666667 | 966.295 |
| 0.6173611111111111 | 947.58 |
| 0.6180555555555556 | 966.295 |
| 0.61875 | 970.034 |
| 0.6194444444444445 | 958.814 |
| 0.6201388888888889 | 973.772 |
| 0.6208333333333333 | 973.772 |
| 0.6215277777777778 | 977.508 |
| 0.6222222222222222 | 973.772 |
| 0.6229166666666667 | 951.327 |
| 0.6236111111111111 | 955.071 |
| 0.6243055555555556 | 947.58 |
| 0.625 | 943.832 |
| 0.6256944444444444 | 932.576 |
| 0.6263888888888889 | 913.766 |
| 0.6270833333333333 | 917.534 |
| 0.6277777777777778 | 921.298 |
| 0.6284722222222222 | 921.298 |
| 0.6291666666666667 | 909.996 |
| 0.6298611111111111 | 906.223 |
| 0.6305555555555555 | 906.223 |
| 0.63125 | 894.885 |
| 0.6319444444444444 | 891.099 |
| 0.6326388888888889 | 894.885 |
| 0.6333333333333333 | 887.309 |
| 0.6340277777777777 | 883.516 |
| 0.6347222222222222 | 872.114 |
| 0.6354166666666666 | 853.029 |
| 0.6361111111111112 | 849.199 |
| 0.6368055555555555 | 841.526 |
| 0.6375000000000001 | 841.526 |
| 0.6381944444444444 | 864.493 |
| 0.638888888888889 | 856.855 |
| 0.6395833333333333 | 853.029 |
| 0.6402777777777778 | 853.029 |
| 0.6409722222222222 | 845.365 |
| 0.6416666666666667 | 841.526 |
| 0.642361111111111 | 829.981 |
| 0.6430555555555556 | 822.26 |
| 0.6437499999999999 | 802.868 |
| 0.6444444444444445 | 798.974 |
| 0.6451388888888888 | 795.074 |
| 0.6458333333333334 | 802.868 |
| 0.6465277777777778 | 806.757 |
| 0.6472222222222223 | 802.868 |
| 0.6479166666666667 | 795.074 |
| 0.6486111111111111 | 791.169 |
| 0.6493055555555556 | 751.803 |
| 0.65 | 735.89 |
| 0.6506944444444445 | 747.834 |
| 0.6513888888888889 | 747.834 |
| 0.6520833333333333 | 739.877 |
| 0.6527777777777778 | 735.89 |
| 0.6534722222222222 | 699.717 |
| 0.6541666666666667 | 683.473 |
| 0.6548611111111111 | 687.544 |
| 0.6555555555555556 | 707.8 |
| 0.65625 | 711.832 |
| 0.6569444444444444 | 707.8 |
| 0.6576388888888889 | 699.717 |
| 0.6583333333333333 | 691.608 |
| 0.6590277777777778 | 683.473 |
| 0.6597222222222222 | 667.123 |
| 0.6604166666666667 | 663.019 |
| 0.6611111111111111 | 650.667 |
| 0.6618055555555555 | 621.613 |
| 0.6625 | 638.256 |
| 0.6631944444444444 | 629.948 |
| 0.6638888888888889 | 621.613 |
| 0.6645833333333333 | 634.105 |
| 0.6652777777777777 | 625.784 |
| 0.6659722222222222 | 629.948 |
| 0.6666666666666666 | 613.252 |
| 0.6673611111111111 | 609.062 |
| 0.6680555555555556 | 604.864 |
| 0.6687500000000001 | 609.062 |
| 0.6694444444444444 | 596.45 |
| 0.6701388888888888 | 596.45 |
| 0.6708333333333334 | 592.233 |
| 0.6715277777777778 | 579.542 |
| 0.6722222222222222 | 571.049 |
| 0.6729166666666666 | 558.261 |
| 0.6736111111111112 | 545.416 |
| 0.6743055555555556 | 532.513 |
| 0.6749999999999999 | 523.88 |
| 0.6756944444444444 | 510.885 |
| 0.6763888888888889 | 502.192 |
| 0.6770833333333334 | 489.108 |
| 0.6777777777777777 | 475.972 |
| 0.6784722222222223 | 453.968 |
| 0.6791666666666667 | 431.833 |
| 0.6798611111111111 | 409.574 |
| 0.6805555555555555 | 396.164 |
| 0.68125 | 387.202 |
| 0.6819444444444445 | 378.224 |
| 0.6826388888888889 | 369.23 |
| 0.6833333333333332 | 351.198 |
| 0.6840277777777778 | 337.639 |
| 0.6847222222222222 | 305.898 |
| 0.6854166666666667 | 278.603 |
| 0.686111111111111 | 251.251 |
| 0.6868055555555556 | 233 |
| 0.6875 | 228.436 |
| 0.6881944444444444 | 223.873 |
| 0.688888888888889 | 223.873 |
| 0.6895833333333333 | 228.436 |
| 0.6902777777777778 | 228.436 |
| 0.6909722222222222 | 228.436 |
| 0.6916666666666668 | 228.436 |
| 0.6923611111111111 | 223.873 |
| 0.6930555555555555 | 214.746 |
| 0.69375 | 214.746 |
| 0.6944444444444445 | 210.182 |
| 0.6951388888888889 | 205.62 |
| 0.6958333333333333 | 205.62 |
| 0.6965277777777777 | 205.62 |
| 0.6972222222222223 | 205.62 |
| 0.6979166666666666 | 201.058 |
| 0.6986111111111111 | 201.058 |
| 0.6993055555555556 | 201.058 |
| 0.7000000000000001 | 196.497 |
| 0.7006944444444444 | 196.497 |
| 0.7013888888888888 | 196.497 |
| 0.7020833333333334 | 196.497 |
| 0.7027777777777778 | 196.497 |
| 0.7034722222222222 | 191.937 |
| 0.7041666666666666 | 191.937 |
| 0.7048611111111112 | 191.937 |
| 0.7055555555555556 | 191.937 |
| 0.7062499999999999 | 187.378 |
| 0.7069444444444444 | 187.378 |
| 0.7076388888888889 | 187.378 |
| 0.7083333333333334 | 187.378 |
| 0.7090277777777777 | 182.82 |
| 0.7097222222222223 | 178.264 |
| 0.7104166666666667 | 173.709 |
| 0.7111111111111111 | 169.156 |
| 0.7118055555555555 | 164.605 |
| 0.7125 | 164.605 |
| 0.7131944444444445 | 164.605 |
| 0.7138888888888889 | 164.605 |
| 0.7145833333333332 | 164.605 |
| 0.7152777777777778 | 164.605 |
| 0.7159722222222222 | 164.605 |
| 0.7166666666666667 | 160.056 |
| 0.717361111111111 | 160.056 |
| 0.7180555555555556 | 160.056 |
| 0.71875 | 155.509 |
| 0.7194444444444444 | 155.509 |
| 0.720138888888889 | 155.509 |
| 0.7208333333333333 | 155.509 |
| 0.7215277777777778 | 150.964 |
| 0.7222222222222222 | 150.964 |
| 0.7229166666666668 | 146.423 |
| 0.7236111111111111 | 146.423 |
| 0.7243055555555555 | 141.884 |
| 0.725 | 141.884 |
| 0.7256944444444445 | 137.347 |
| 0.7263888888888889 | 137.347 |
| 0.7270833333333333 | 137.347 |
| 0.7277777777777777 | 137.347 |
| 0.7284722222222223 | 137.347 |
| 0.7291666666666666 | 137.347 |
| 0.7298611111111111 | 141.884 |
| 0.7305555555555556 | 137.347 |
| 0.7312500000000001 | 137.347 |
| 0.7319444444444444 | 137.347 |
| 0.7326388888888888 | 137.347 |
| 0.7333333333333334 | 137.347 |
| 0.7340277777777778 | 137.347 |
| 0.7347222222222222 | 132.814 |
| 0.7354166666666666 | 128.284 |
| 0.7361111111111112 | 123.758 |
| 0.7368055555555556 | 123.758 |
| 0.7374999999999999 | 123.758 |
| 0.7381944444444444 | 123.758 |
| 0.7388888888888889 | 123.758 |
| 0.7395833333333334 | 123.758 |
| 0.7402777777777777 | 119.235 |
| 0.7409722222222223 | 119.235 |
| 0.7416666666666667 | 119.235 |
| 0.7423611111111111 | 114.716 |
| 0.7430555555555555 | 114.716 |
| 0.74375 | 114.716 |
| 0.7444444444444445 | 114.716 |
| 0.7451388888888889 | 110.201 |
| 0.7458333333333332 | 105.69 |
| 0.7465277777777778 | 105.69 |
| 0.7472222222222222 | 101.184 |
| 0.7479166666666667 | 101.184 |
| 0.748611111111111 | 96.682 |
| 0.7493055555555556 | 92.184 |
| 0.75 | 87.692 |
| 0.7506944444444444 | 83.205 |
| 0.751388888888889 | 83.205 |
| 0.7520833333333333 | 83.205 |
| 0.7527777777777778 | 83.205 |
| 0.7534722222222222 | 83.205 |
| 0.7541666666666668 | 83.205 |
| 0.7548611111111111 | 87.692 |
| 0.7555555555555555 | 83.205 |
| 0.75625 | 83.205 |
| 0.7569444444444445 | 83.205 |
| 0.7576388888888889 | 78.722 |
| 0.7583333333333333 | 78.722 |
| 0.7590277777777777 | 74.246 |
| 0.7597222222222223 | 74.246 |
| 0.7604166666666666 | 74.246 |
| 0.7611111111111111 | 74.246 |
| 0.7618055555555556 | 69.775 |
| 0.7625000000000001 | 69.775 |
| 0.7631944444444444 | 65.31 |
| 0.7638888888888888 | 65.31 |
| 0.7645833333333334 | 65.31 |
| 0.7652777777777778 | 65.31 |
| 0.7659722222222222 | 65.31 |
| 0.7666666666666666 | 60.85 |
| 0.7673611111111112 | 60.85 |
| 0.7680555555555556 | 60.85 |
| 0.7687499999999999 | 60.85 |
| 0.7694444444444444 | 56.398 |
| 0.7701388888888889 | 56.398 |
| 0.7708333333333334 | 56.398 |
| 0.7715277777777777 | 56.398 |
| 0.7722222222222223 | 56.398 |
| 0.7729166666666667 | 56.398 |
| 0.7736111111111111 | 56.398 |
| 0.7743055555555555 | 51.951 |
| 0.775 | 51.951 |
| 0.7756944444444445 | 51.951 |
| 0.7763888888888889 | 47.511 |
| 0.7770833333333332 | 47.511 |
| 0.7777777777777778 | 47.511 |
| 0.7784722222222222 | 43.079 |
| 0.7791666666666667 | 43.079 |
| 0.779861111111111 | 38.653 |
| 0.7805555555555556 | 38.653 |
| 0.78125 | 43.079 |
| 0.7819444444444444 | 43.079 |
| 0.782638888888889 | 43.079 |
| 0.7833333333333333 | 38.653 |
| 0.7840277777777778 | 38.653 |
| 0.7847222222222222 | 38.653 |
| 0.7854166666666668 | 38.653 |
| 0.7861111111111111 | 34.234 |
| 0.7868055555555555 | 34.234 |
| 0.7875 | 29.823 |
| 0.7881944444444445 | 29.823 |
| 0.7888888888888889 | 29.823 |
| 0.7895833333333333 | 29.823 |
| 0.7902777777777777 | 25.419 |
| 0.7909722222222223 | 25.419 |
| 0.7916666666666666 | 25.419 |
| 0.7923611111111111 | 25.419 |
| 0.7930555555555556 | 25.419 |
| 0.7937500000000001 | 25.419 |
| 0.7944444444444444 | 25.419 |
| 0.7951388888888888 | 25.419 |
| 0.7958333333333334 | 25.419 |
| 0.7965277777777778 | 25.419 |
| 0.7972222222222222 | 25.419 |
| 0.7979166666666666 | 25.419 |
| 0.7986111111111112 | 21.024 |
| 0.7993055555555556 | 21.024 |
| 0.7999999999999999 | 21.024 |
| 0.8006944444444444 | 21.024 |
| 0.8013888888888889 | 16.636 |
| 0.8020833333333334 | 16.636 |
| 0.8027777777777777 | 16.636 |
| 0.8034722222222223 | 12.257 |
| 0.8041666666666667 | 12.257 |
| 0.8048611111111111 | 12.257 |
| 0.8055555555555555 | 12.257 |
| 0.80625 | 7.887 |
| 0.8069444444444445 | 3.525 |
| 0.8076388888888889 | 3.525 |
| 0.8083333333333332 | 3.525 |
| 0.8090277777777778 | 3.525 |
| 0.8097222222222222 | 3.525 |
| 0.8104166666666667 | 3.525 |
| 0.811111111111111 | 0 |
| 0.8118055555555556 | 0 |
| 0.8125 | 0 |
| 0.8131944444444444 | 0 |
| 0.813888888888889 | 0 |
| 0.8145833333333333 | 0 |
| 0.8152777777777778 | 0 |
| 0.8159722222222222 | 0 |
| 0.8166666666666668 | 0 |
| 0.8173611111111111 | 0 |
| 0.8180555555555555 | 0 |
| 0.81875 | 0 |
| 0.8194444444444445 | 0 |
| 0.8201388888888889 | 0 |
| 0.8208333333333333 | 0 |
| 0.8215277777777777 | 0 |
| 0.8222222222222223 | 0 |
| 0.8229166666666666 | 0 |
| 0.8236111111111111 | 0 |
| 0.8243055555555556 | 0 |
| 0.8250000000000001 | 0 |
| 0.8256944444444444 | 0 |
| 0.8263888888888888 | 0 |
| 0.8270833333333334 | 0 |
| 0.8277777777777778 | 0 |
| 0.8284722222222222 | 0 |
| 0.8291666666666666 | 0 |
| 0.8298611111111112 | 0 |
| 0.8305555555555556 | 0 |
| 0.8312499999999999 | 0 |
| 0.8319444444444444 | 0 |
| 0.8326388888888889 | 0 |
| 0.8333333333333334 | 0 |
| 0.8340277777777777 | 0 |
| 0.8347222222222223 | 0 |
| 0.8354166666666667 | 0 |
| 0.8361111111111111 | 0 |
| 0.8368055555555555 | 0 |
| 0.8375 | 0 |
| 0.8381944444444445 | 0 |
| 0.8388888888888889 | 0 |
| 0.8395833333333332 | 0 |
| 0.8402777777777778 | 0 |
| 0.8409722222222222 | 0 |
| 0.8416666666666667 | 0 |
| 0.842361111111111 | 0 |
| 0.8430555555555556 | 0 |
| 0.84375 | 0 |
| 0.8444444444444444 | 0 |
| 0.845138888888889 | 0 |
| 0.8458333333333333 | 0 |
| 0.8465277777777778 | 0 |
| 0.8472222222222222 | 0 |
| 0.8479166666666668 | 0 |
| 0.8486111111111111 | 0 |
| 0.8493055555555555 | 0 |
| 0.85 | 0 |
| 0.8506944444444445 | 0 |
| 0.8513888888888889 | 0 |
| 0.8520833333333333 | 0 |
| 0.8527777777777777 | 0 |
| 0.8534722222222223 | 0 |
| 0.8541666666666666 | 0 |
| 0.8548611111111111 | 0 |
| 0.8555555555555556 | 0 |
| 0.8562500000000001 | 0 |
| 0.8569444444444444 | 0 |
| 0.8576388888888888 | 0 |
| 0.8583333333333334 | 0 |
| 0.8590277777777778 | 0 |
| 0.8597222222222222 | 0 |
| 0.8604166666666666 | 0 |
| 0.8611111111111112 | 0 |
| 0.8618055555555556 | 0 |
| 0.8624999999999999 | 0 |
| 0.8631944444444444 | 0 |
| 0.8638888888888889 | 0 |
| 0.8645833333333334 | 0 |
| 0.8652777777777777 | 0 |
| 0.8659722222222223 | 0 |
| 0.8666666666666667 | 0 |
| 0.8673611111111111 | 0 |
| 0.8680555555555555 | 0 |
| 0.86875 | 0 |
| 0.8694444444444445 | 0 |
| 0.8701388888888889 | 0 |
| 0.8708333333333332 | 0 |
| 0.8715277777777778 | 0 |
| 0.8722222222222222 | 0 |
| 0.8729166666666667 | 0 |
| 0.873611111111111 | 0 |
| 0.8743055555555556 | 0 |
| 0.875 | 0 |
| 0.8756944444444444 | 0 |
| 0.876388888888889 | 0 |
| 0.8770833333333333 | 0 |
| 0.8777777777777778 | 0 |
| 0.8784722222222222 | 0 |
| 0.8791666666666668 | 0 |
| 0.8798611111111111 | 0 |
| 0.8805555555555555 | 0 |
| 0.88125 | 0 |
| 0.8819444444444445 | 0 |
| 0.8826388888888889 | 0 |
| 0.8833333333333333 | 0 |
| 0.8840277777777777 | 0 |
| 0.8847222222222223 | 0 |
| 0.8854166666666666 | 0 |
| 0.8861111111111111 | 0 |
| 0.8868055555555556 | 0 |
| 0.8875000000000001 | 0 |
| 0.8881944444444444 | 0 |
| 0.8888888888888888 | 0 |
| 0.8895833333333334 | 0 |
| 0.8902777777777778 | 0 |
| 0.8909722222222222 | 0 |
| 0.8916666666666666 | 0 |
| 0.8923611111111112 | 0 |
| 0.8930555555555556 | 0 |
| 0.8937499999999999 | 0 |
| 0.8944444444444444 | 0 |
| 0.8951388888888889 | 0 |
| 0.8958333333333334 | 0 |
| 0.8965277777777777 | 0 |
| 0.8972222222222223 | 0 |
| 0.8979166666666667 | 0 |
| 0.8986111111111111 | 0 |
| 0.8993055555555555 | 0 |
| 0.9 | 0 |
| 0.9006944444444445 | 0 |
| 0.9013888888888889 | 0 |
| 0.9020833333333332 | 0 |
| 0.9027777777777778 | 0 |
| 0.9034722222222222 | 0 |
| 0.9041666666666667 | 0 |
| 0.904861111111111 | 0 |
| 0.9055555555555556 | 0 |
| 0.90625 | 0 |
| 0.9069444444444444 | 0 |
| 0.907638888888889 | 0 |
| 0.9083333333333333 | 0 |
| 0.9090277777777778 | 0 |
| 0.9097222222222222 | 0 |
| 0.9104166666666668 | 0 |
| 0.9111111111111111 | 0 |
| 0.9118055555555555 | 0 |
| 0.9125 | 0 |
| 0.9131944444444445 | 0 |
| 0.9138888888888889 | 0 |
| 0.9145833333333333 | 0 |
| 0.9152777777777777 | 0 |
| 0.9159722222222223 | 0 |
| 0.9166666666666666 | 0 |
| 0.9173611111111111 | 0 |
| 0.9180555555555556 | 0 |
| 0.9187500000000001 | 0 |
| 0.9194444444444444 | 0 |
| 0.9201388888888888 | 0 |
| 0.9208333333333334 | 0 |
| 0.9215277777777778 | 0 |
| 0.9222222222222222 | 0 |
| 0.9229166666666666 | 0 |
| 0.9236111111111112 | 0 |
| 0.9243055555555556 | 0 |
| 0.9249999999999999 | 0 |
| 0.9256944444444444 | 0 |
| 0.9263888888888889 | 0 |
| 0.9270833333333334 | 0 |
| 0.9277777777777777 | 0 |
| 0.9284722222222223 | 0 |
| 0.9291666666666667 | 0 |
| 0.9298611111111111 | 0 |
| 0.9305555555555555 | 0 |
| 0.93125 | 0 |
| 0.9319444444444445 | 0 |
| 0.9326388888888889 | 0 |
| 0.9333333333333332 | 0 |
| 0.9340277777777778 | 0 |
| 0.9347222222222222 | 0 |
| 0.9354166666666667 | 0 |
| 0.936111111111111 | 0 |
| 0.9368055555555556 | 0 |
| 0.9375 | 0 |
| 0.9381944444444444 | 0 |
| 0.938888888888889 | 0 |
| 0.9395833333333333 | 0 |
| 0.9402777777777778 | 0 |
| 0.9409722222222222 | 0 |
| 0.9416666666666668 | 0 |
| 0.9423611111111111 | 0 |
| 0.9430555555555555 | 0 |
| 0.94375 | 0 |
| 0.9444444444444445 | 0 |
| 0.9451388888888889 | 0 |
| 0.9458333333333333 | 0 |
| 0.9465277777777777 | 0 |
| 0.9472222222222223 | 0 |
| 0.9479166666666666 | 0 |
| 0.9486111111111111 | 0 |
| 0.9493055555555556 | 0 |
| 0.9500000000000001 | 0 |
| 0.9506944444444444 | 0 |
| 0.9513888888888888 | 0 |
| 0.9520833333333334 | 0 |
| 0.9527777777777778 | 0 |
| 0.9534722222222222 | 0 |
| 0.9541666666666666 | 0 |
| 0.9548611111111112 | 0 |
| 0.9555555555555556 | 0 |
| 0.9562499999999999 | 0 |
| 0.9569444444444444 | 0 |
| 0.9576388888888889 | 0 |
| 0.9583333333333334 | 0 |
| 0.9590277777777777 | 0 |
| 0.9597222222222223 | 0 |
| 0.9604166666666667 | 0 |
| 0.9611111111111111 | 0 |
| 0.9618055555555555 | 0 |
| 0.9625 | 0 |
| 0.9631944444444445 | 0 |
| 0.9638888888888889 | 0 |
| 0.9645833333333332 | 0 |
| 0.9652777777777778 | 0 |
| 0.9659722222222222 | 0 |
| 0.9666666666666667 | 0 |
| 0.967361111111111 | 0 |
| 0.9680555555555556 | 0 |
| 0.96875 | 0 |
| 0.9694444444444444 | 0 |
| 0.970138888888889 | 0 |
| 0.9708333333333333 | 0 |
| 0.9715277777777778 | 0 |
| 0.9722222222222222 | 0 |
| 0.9729166666666668 | 0 |
| 0.9736111111111111 | 0 |
| 0.9743055555555555 | 0 |
| 0.975 | 0 |
| 0.9756944444444445 | 0 |
| 0.9763888888888889 | 0 |
| 0.9770833333333333 | 0 |
| 0.9777777777777777 | 0 |
| 0.9784722222222223 | 0 |
| 0.9791666666666666 | 0 |
| 0.9798611111111111 | 0 |
| 0.9805555555555556 | 0 |
| 0.9812500000000001 | 0 |
| 0.9819444444444444 | 0 |
| 0.9826388888888888 | 0 |
| 0.9833333333333334 | 0 |
| 0.9840277777777778 | 0 |
| 0.9847222222222222 | 0 |
| 0.9854166666666666 | 0 |
| 0.9861111111111112 | 0 |
| 0.9868055555555556 | 0 |
| 0.9874999999999999 | 0 |
| 0.9881944444444444 | 0 |
| 0.9888888888888889 | 0 |
| 0.9895833333333334 | 0 |
| 0.9902777777777777 | 0 |
| 0.9909722222222223 | 0 |
| 0.9916666666666667 | 0 |
| 0.9923611111111111 | 0 |
| 0.9930555555555555 | 0 |
| 0.99375 | 0 |
| 0.9944444444444445 | 0 |
| 0.9951388888888889 | 0 |
| 0.9958333333333332 | 0 |
| 0.9965277777777778 | 0 |
| 0.9972222222222222 | 0 |
| 0.9979166666666667 | 0 |
| 0.998611111111111 | 0 |
| 0.9993055555555556 | 0 |